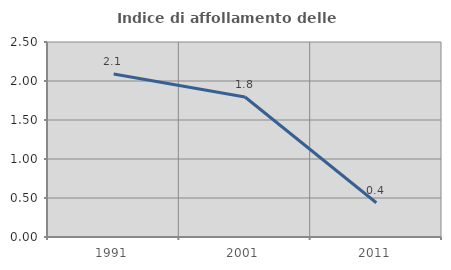
| Category | Indice di affollamento delle abitazioni  |
|---|---|
| 1991.0 | 2.089 |
| 2001.0 | 1.795 |
| 2011.0 | 0.439 |